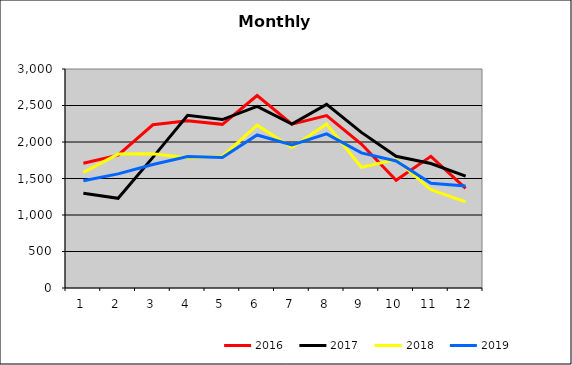
| Category | 2016 | 2017 | 2018 | 2019 |
|---|---|---|---|---|
| 0 | 1709.692 | 1297.347 | 1584.945 | 1467.961 |
| 1 | 1818.591 | 1228.546 | 1834.566 | 1563.301 |
| 2 | 2235.971 | 1789.782 | 1838.878 | 1692.17 |
| 3 | 2290.052 | 2364.914 | 1785.082 | 1799.954 |
| 4 | 2241.602 | 2307.576 | 1801.761 | 1787.008 |
| 5 | 2636.687 | 2488.575 | 2229.629 | 2096.552 |
| 6 | 2245.31 | 2244.746 | 1923.685 | 1959.132 |
| 7 | 2362.2 | 2515.952 | 2246.519 | 2111.404 |
| 8 | 1971.49 | 2131.972 | 1654.017 | 1851.294 |
| 9 | 1477.1 | 1804.009 | 1760.102 | 1740.445 |
| 10 | 1802.993 | 1705.861 | 1345.712 | 1434.409 |
| 11 | 1366.089 | 1533.212 | 1179.594 | 1396.753 |